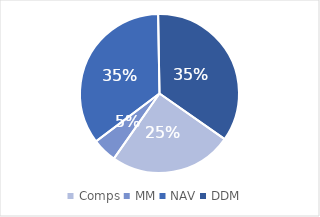
| Category | Series 0 |
|---|---|
| Comps | 0.25 |
| MM | 0.05 |
| NAV | 0.35 |
| DDM | 0.35 |